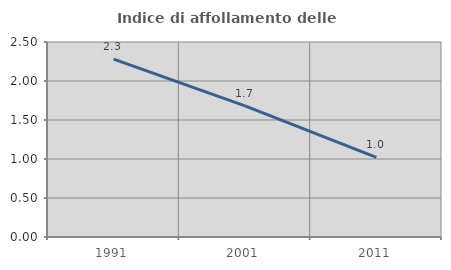
| Category | Indice di affollamento delle abitazioni  |
|---|---|
| 1991.0 | 2.28 |
| 2001.0 | 1.681 |
| 2011.0 | 1.021 |